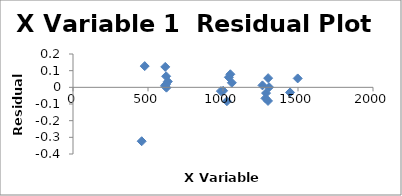
| Category | Series 0 |
|---|---|
| 1059.0 | 0.027 |
| 1049.0 | 0.078 |
| 1039.0 | 0.06 |
| 1026.0 | -0.083 |
| 1001.0 | -0.021 |
| 986.0 | -0.023 |
| 1447.0 | -0.03 |
| 458.0 | -0.323 |
| 1263.0 | 0.012 |
| 1283.0 | -0.066 |
| 1301.0 | 0.055 |
| 1287.0 | -0.034 |
| 1300.0 | -0.082 |
| 1307.0 | 0.001 |
| 632.0 | 0.035 |
| 621.0 | 0.066 |
| 623.0 | -0.002 |
| 620.0 | 0.018 |
| 613.0 | 0.009 |
| 615.0 | 0.123 |
| 478.0 | 0.127 |
| 1498.0 | 0.053 |